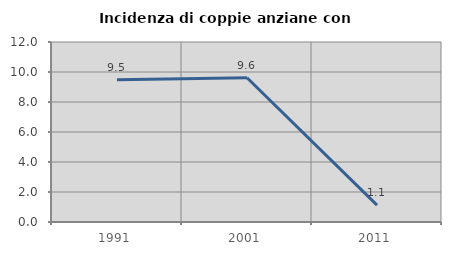
| Category | Incidenza di coppie anziane con figli |
|---|---|
| 1991.0 | 9.483 |
| 2001.0 | 9.615 |
| 2011.0 | 1.124 |